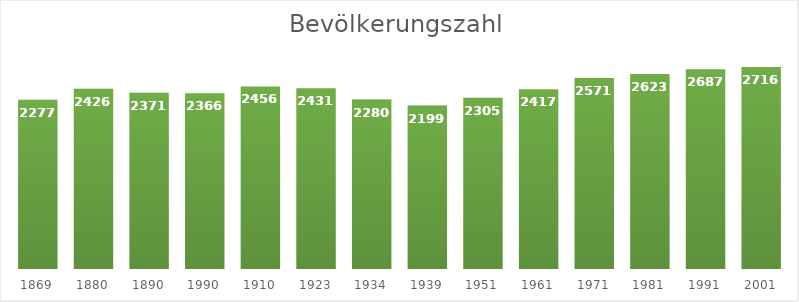
| Category | Bevölkerungszahl |
|---|---|
| 1869.0 | 2277 |
| 1880.0 | 2426 |
| 1890.0 | 2371 |
| 1990.0 | 2366 |
| 1910.0 | 2456 |
| 1923.0 | 2431 |
| 1934.0 | 2280 |
| 1939.0 | 2199 |
| 1951.0 | 2305 |
| 1961.0 | 2417 |
| 1971.0 | 2571 |
| 1981.0 | 2623 |
| 1991.0 | 2687 |
| 2001.0 | 2716 |